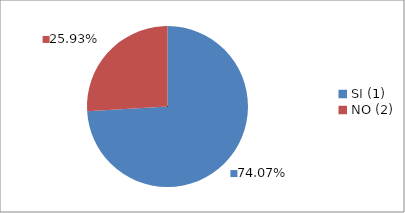
| Category | Series 0 |
|---|---|
| SI (1) | 0.741 |
| NO (2) | 0.259 |